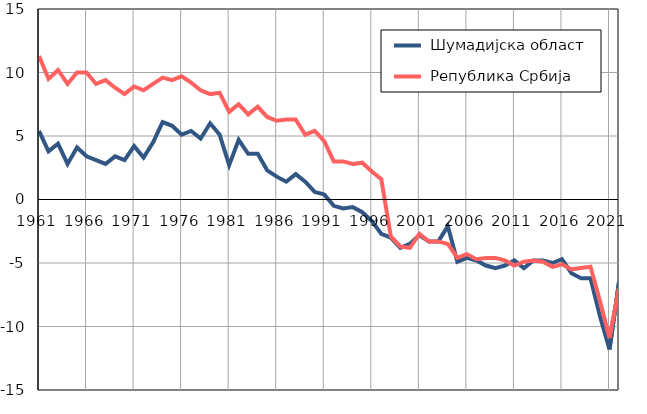
| Category |  Шумадијска област |  Република Србија |
|---|---|---|
| 1961.0 | 5.4 | 11.3 |
| 1962.0 | 3.8 | 9.5 |
| 1963.0 | 4.4 | 10.2 |
| 1964.0 | 2.8 | 9.1 |
| 1965.0 | 4.1 | 10 |
| 1966.0 | 3.4 | 10 |
| 1967.0 | 3.1 | 9.1 |
| 1968.0 | 2.8 | 9.4 |
| 1969.0 | 3.4 | 8.8 |
| 1970.0 | 3.1 | 8.3 |
| 1971.0 | 4.2 | 8.9 |
| 1972.0 | 3.3 | 8.6 |
| 1973.0 | 4.5 | 9.1 |
| 1974.0 | 6.1 | 9.6 |
| 1975.0 | 5.8 | 9.4 |
| 1976.0 | 5.1 | 9.7 |
| 1977.0 | 5.4 | 9.2 |
| 1978.0 | 4.8 | 8.6 |
| 1979.0 | 6 | 8.3 |
| 1980.0 | 5.1 | 8.4 |
| 1981.0 | 2.7 | 6.9 |
| 1982.0 | 4.7 | 7.5 |
| 1983.0 | 3.6 | 6.7 |
| 1984.0 | 3.6 | 7.3 |
| 1985.0 | 2.3 | 6.5 |
| 1986.0 | 1.8 | 6.2 |
| 1987.0 | 1.4 | 6.3 |
| 1988.0 | 2 | 6.3 |
| 1989.0 | 1.4 | 5.1 |
| 1990.0 | 0.6 | 5.4 |
| 1991.0 | 0.4 | 4.6 |
| 1992.0 | -0.5 | 3 |
| 1993.0 | -0.7 | 3 |
| 1994.0 | -0.6 | 2.8 |
| 1995.0 | -1 | 2.9 |
| 1996.0 | -1.7 | 2.2 |
| 1997.0 | -2.7 | 1.6 |
| 1998.0 | -3 | -2.9 |
| 1999.0 | -3.8 | -3.7 |
| 2000.0 | -3.5 | -3.8 |
| 2001.0 | -2.8 | -2.7 |
| 2002.0 | -3.3 | -3.3 |
| 2003.0 | -3.3 | -3.3 |
| 2004.0 | -2.1 | -3.5 |
| 2005.0 | -4.9 | -4.6 |
| 2006.0 | -4.6 | -4.3 |
| 2007.0 | -4.8 | -4.7 |
| 2008.0 | -5.2 | -4.6 |
| 2009.0 | -5.4 | -4.6 |
| 2010.0 | -5.2 | -4.8 |
| 2011.0 | -4.8 | -5.2 |
| 2012.0 | -5.4 | -4.9 |
| 2013.0 | -4.8 | -4.8 |
| 2014.0 | -4.8 | -4.9 |
| 2015.0 | -5 | -5.3 |
| 2016.0 | -4.7 | -5.1 |
| 2017.0 | -5.8 | -5.5 |
| 2018.0 | -6.2 | -5.4 |
| 2019.0 | -6.2 | -5.3 |
| 2020.0 | -9.2 | -8 |
| 2021.0 | -11.8 | -10.9 |
| 2022.0 | -6.5 | -7 |